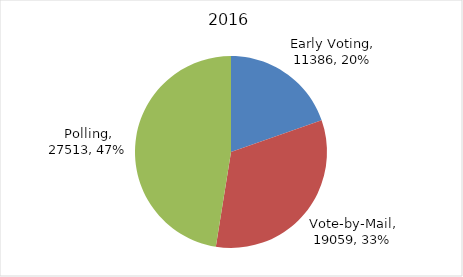
| Category | Series 0 |
|---|---|
| Early Voting | 11386 |
| Vote-by-Mail | 19059 |
| Polling | 27513 |